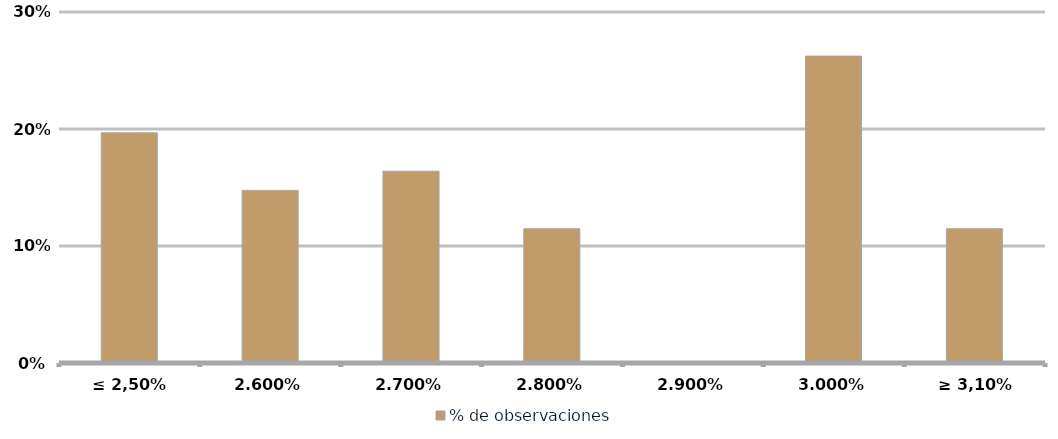
| Category | % de observaciones  |
|---|---|
| ≤ 2,50% | 0.197 |
| 2.60% | 0.148 |
| 2.70% | 0.164 |
| 2.80% | 0.115 |
| 2.90% | 0 |
| 3.00% | 0.262 |
| ≥ 3,10% | 0.115 |